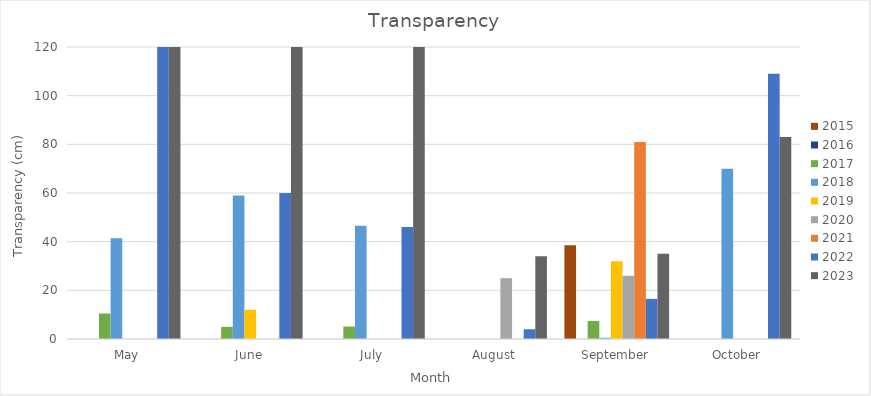
| Category | 2015 | 2016 | 2017 | 2018 | 2019 | 2020 | 2021 | 2022 | 2023 |
|---|---|---|---|---|---|---|---|---|---|
| May | 0 | 0 | 10.48 | 41.4 | 0 | 0 | 0 | 120 | 120 |
| June | 0 | 0 | 5 | 59 | 12 | 0 | 0 | 60 | 120 |
| July | 0 | 0 | 5.11 | 46.5 | 0 | 0 | 0 | 46 | 120 |
| August | 0 | 0 | 0 | 0 | 0 | 25 | 0 | 4 | 34 |
| September | 38.5 | 0 | 7.4 | 0.5 | 32 | 26 | 81 | 16.5 | 35 |
| October | 0 | 0 | 0 | 70 | 0 | 0 | 0 | 109 | 83 |